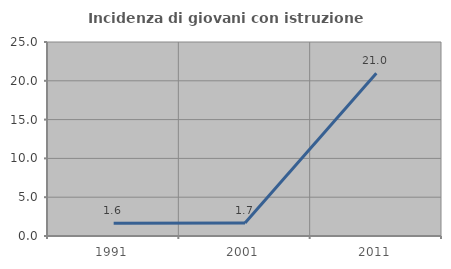
| Category | Incidenza di giovani con istruzione universitaria |
|---|---|
| 1991.0 | 1.639 |
| 2001.0 | 1.667 |
| 2011.0 | 20.968 |